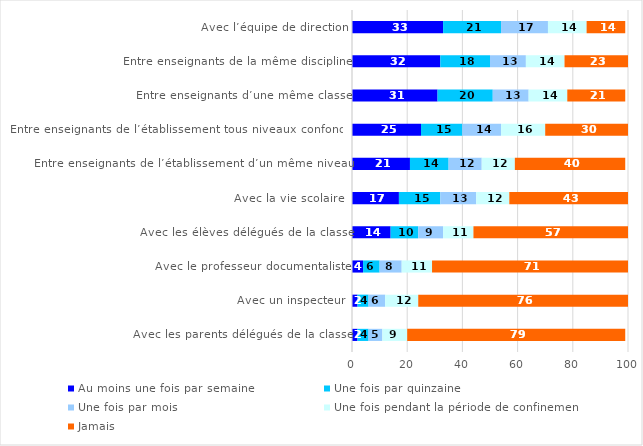
| Category | Au moins une fois par semaine | Une fois par quinzaine | Une fois par mois | Une fois pendant la période de confinement | Jamais |
|---|---|---|---|---|---|
| Avec l’équipe de direction | 33 | 21 | 17 | 14 | 14 |
| Entre enseignants de la même discipline | 32 | 18 | 13 | 14 | 23 |
| Entre enseignants d’une même classe | 31 | 20 | 13 | 14 | 21 |
| Entre enseignants de l’établissement tous niveaux confondus | 25 | 15 | 14 | 16 | 30 |
| Entre enseignants de l’établissement d’un même niveau  | 21 | 14 | 12 | 12 | 40 |
| Avec la vie scolaire  | 17 | 15 | 13 | 12 | 43 |
| Avec les élèves délégués de la classe | 14 | 10 | 9 | 11 | 57 |
| Avec le professeur documentaliste | 4 | 6 | 8 | 11 | 71 |
| Avec un inspecteur | 2 | 4 | 6 | 12 | 76 |
| Avec les parents délégués de la classe | 2 | 4 | 5 | 9 | 79 |